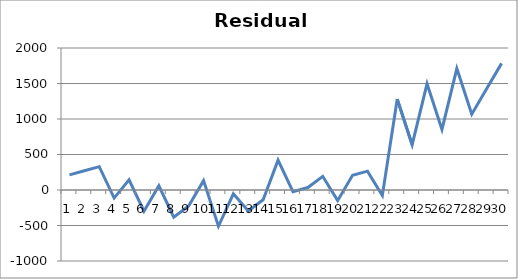
| Category | Series 0 |
|---|---|
| 0 | 213.43 |
| 1 | 271.02 |
| 2 | 328.61 |
| 3 | -113.8 |
| 4 | 143.79 |
| 5 | -298.62 |
| 6 | 58.97 |
| 7 | -383.44 |
| 8 | -225.85 |
| 9 | 131.74 |
| 10 | -510.67 |
| 11 | -53.08 |
| 12 | -295.49 |
| 13 | -137.9 |
| 14 | 419.69 |
| 15 | -22.72 |
| 16 | 34.87 |
| 17 | 192.46 |
| 18 | -149.95 |
| 19 | 207.64 |
| 20 | 265.23 |
| 21 | -77.18 |
| 22 | 1280.41 |
| 23 | 638 |
| 24 | 1495.59 |
| 25 | 853.18 |
| 26 | 1710.77 |
| 27 | 1068.36 |
| 28 | 1425.95 |
| 29 | 1783.54 |